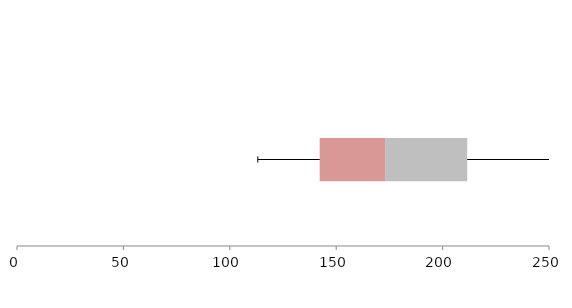
| Category | Series 1 | Series 2 | Series 3 |
|---|---|---|---|
| 0 | 142.251 | 30.738 | 38.578 |